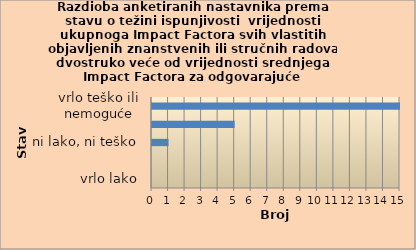
| Category | Series 0 |
|---|---|
| vrlo lako | 0 |
| lako | 0 |
| ni lako, ni teško | 1 |
| teško | 5 |
| vrlo teško ili nemoguće | 15 |